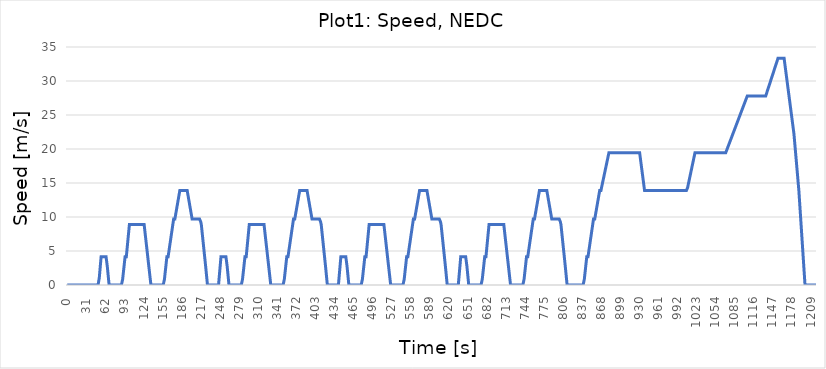
| Category | Series 0 |
|---|---|
| 0.0 | 0 |
| 1.0 | 0 |
| 2.0 | 0 |
| 3.0 | 0 |
| 4.0 | 0 |
| 5.0 | 0 |
| 6.0 | 0 |
| 7.0 | 0 |
| 8.0 | 0 |
| 9.0 | 0 |
| 10.0 | 0 |
| 11.0 | 0 |
| 12.0 | 0 |
| 13.0 | 0 |
| 14.0 | 0 |
| 15.0 | 0 |
| 16.0 | 0 |
| 17.0 | 0 |
| 18.0 | 0 |
| 19.0 | 0 |
| 20.0 | 0 |
| 21.0 | 0 |
| 22.0 | 0 |
| 23.0 | 0 |
| 24.0 | 0 |
| 25.0 | 0 |
| 26.0 | 0 |
| 27.0 | 0 |
| 28.0 | 0 |
| 29.0 | 0 |
| 30.0 | 0 |
| 31.0 | 0 |
| 32.0 | 0 |
| 33.0 | 0 |
| 34.0 | 0 |
| 35.0 | 0 |
| 36.0 | 0 |
| 37.0 | 0 |
| 38.0 | 0 |
| 39.0 | 0 |
| 40.0 | 0 |
| 41.0 | 0 |
| 42.0 | 0 |
| 43.0 | 0 |
| 44.0 | 0 |
| 45.0 | 0 |
| 46.0 | 0 |
| 47.0 | 0 |
| 48.0 | 0 |
| 49.0 | 0 |
| 50.0 | 0 |
| 51.0 | 0 |
| 52.0 | 1.042 |
| 53.0 | 2.083 |
| 54.0 | 3.125 |
| 55.0 | 4.167 |
| 56.0 | 4.167 |
| 57.0 | 4.167 |
| 58.0 | 4.167 |
| 59.0 | 4.167 |
| 60.0 | 4.167 |
| 61.0 | 4.167 |
| 62.0 | 4.167 |
| 63.0 | 4.167 |
| 64.0 | 3.472 |
| 65.0 | 2.778 |
| 66.0 | 1.852 |
| 67.0 | 0.926 |
| 68.0 | 0 |
| 69.0 | 0 |
| 70.0 | 0 |
| 71.0 | 0 |
| 72.0 | 0 |
| 73.0 | 0 |
| 74.0 | 0 |
| 75.0 | 0 |
| 76.0 | 0 |
| 77.0 | 0 |
| 78.0 | 0 |
| 79.0 | 0 |
| 80.0 | 0 |
| 81.0 | 0 |
| 82.0 | 0 |
| 83.0 | 0 |
| 84.0 | 0 |
| 85.0 | 0 |
| 86.0 | 0 |
| 87.0 | 0 |
| 88.0 | 0 |
| 89.0 | 0 |
| 90.0 | 0.833 |
| 91.0 | 1.667 |
| 92.0 | 2.5 |
| 93.0 | 3.333 |
| 94.0 | 4.167 |
| 95.0 | 4.167 |
| 96.0 | 4.167 |
| 97.0 | 5.111 |
| 98.0 | 6.056 |
| 99.0 | 7 |
| 100.0 | 7.944 |
| 101.0 | 8.889 |
| 102.0 | 8.889 |
| 103.0 | 8.889 |
| 104.0 | 8.889 |
| 105.0 | 8.889 |
| 106.0 | 8.889 |
| 107.0 | 8.889 |
| 108.0 | 8.889 |
| 109.0 | 8.889 |
| 110.0 | 8.889 |
| 111.0 | 8.889 |
| 112.0 | 8.889 |
| 113.0 | 8.889 |
| 114.0 | 8.889 |
| 115.0 | 8.889 |
| 116.0 | 8.889 |
| 117.0 | 8.889 |
| 118.0 | 8.889 |
| 119.0 | 8.889 |
| 120.0 | 8.889 |
| 121.0 | 8.889 |
| 122.0 | 8.889 |
| 123.0 | 8.889 |
| 124.0 | 8.889 |
| 125.0 | 8.889 |
| 126.0 | 8.081 |
| 127.0 | 7.273 |
| 128.0 | 6.465 |
| 129.0 | 5.657 |
| 130.0 | 4.848 |
| 131.0 | 4.04 |
| 132.0 | 3.232 |
| 133.0 | 2.424 |
| 134.0 | 1.616 |
| 135.0 | 0.808 |
| 136.0 | 0 |
| 137.0 | 0 |
| 138.0 | 0 |
| 139.0 | 0 |
| 140.0 | 0 |
| 141.0 | 0 |
| 142.0 | 0 |
| 143.0 | 0 |
| 144.0 | 0 |
| 145.0 | 0 |
| 146.0 | 0 |
| 147.0 | 0 |
| 148.0 | 0 |
| 149.0 | 0 |
| 150.0 | 0 |
| 151.0 | 0 |
| 152.0 | 0 |
| 153.0 | 0 |
| 154.0 | 0 |
| 155.0 | 0 |
| 156.0 | 0 |
| 157.0 | 0 |
| 158.0 | 0.833 |
| 159.0 | 1.667 |
| 160.0 | 2.5 |
| 161.0 | 3.333 |
| 162.0 | 4.167 |
| 163.0 | 4.167 |
| 164.0 | 4.167 |
| 165.0 | 4.784 |
| 166.0 | 5.401 |
| 167.0 | 6.019 |
| 168.0 | 6.636 |
| 169.0 | 7.253 |
| 170.0 | 7.87 |
| 171.0 | 8.488 |
| 172.0 | 9.105 |
| 173.0 | 9.722 |
| 174.0 | 9.722 |
| 175.0 | 9.722 |
| 176.0 | 10.243 |
| 177.0 | 10.764 |
| 178.0 | 11.285 |
| 179.0 | 11.806 |
| 180.0 | 12.326 |
| 181.0 | 12.847 |
| 182.0 | 13.368 |
| 183.0 | 13.889 |
| 184.0 | 13.889 |
| 185.0 | 13.889 |
| 186.0 | 13.889 |
| 187.0 | 13.889 |
| 188.0 | 13.889 |
| 189.0 | 13.889 |
| 190.0 | 13.889 |
| 191.0 | 13.889 |
| 192.0 | 13.889 |
| 193.0 | 13.889 |
| 194.0 | 13.889 |
| 195.0 | 13.889 |
| 196.0 | 13.368 |
| 197.0 | 12.847 |
| 198.0 | 12.326 |
| 199.0 | 11.806 |
| 200.0 | 11.285 |
| 201.0 | 10.764 |
| 202.0 | 10.243 |
| 203.0 | 9.722 |
| 204.0 | 9.722 |
| 205.0 | 9.722 |
| 206.0 | 9.722 |
| 207.0 | 9.722 |
| 208.0 | 9.722 |
| 209.0 | 9.722 |
| 210.0 | 9.722 |
| 211.0 | 9.722 |
| 212.0 | 9.722 |
| 213.0 | 9.722 |
| 214.0 | 9.722 |
| 215.0 | 9.722 |
| 216.0 | 9.722 |
| 217.0 | 9.306 |
| 218.0 | 8.889 |
| 219.0 | 8.016 |
| 220.0 | 7.143 |
| 221.0 | 6.27 |
| 222.0 | 5.397 |
| 223.0 | 4.524 |
| 224.0 | 3.651 |
| 225.0 | 2.778 |
| 226.0 | 1.852 |
| 227.0 | 0.926 |
| 228.0 | 0 |
| 229.0 | 0 |
| 230.0 | 0 |
| 231.0 | 0 |
| 232.0 | 0 |
| 233.0 | 0 |
| 234.0 | 0 |
| 235.0 | 0 |
| 236.0 | 0 |
| 237.0 | 0 |
| 238.0 | 0 |
| 239.0 | 0 |
| 240.0 | 0 |
| 241.0 | 0 |
| 242.0 | 0 |
| 243.0 | 0 |
| 244.0 | 0 |
| 245.0 | 0 |
| 246.0 | 0 |
| 247.0 | 1.042 |
| 248.0 | 2.083 |
| 249.0 | 3.125 |
| 250.0 | 4.167 |
| 251.0 | 4.167 |
| 252.0 | 4.167 |
| 253.0 | 4.167 |
| 254.0 | 4.167 |
| 255.0 | 4.167 |
| 256.0 | 4.167 |
| 257.0 | 4.167 |
| 258.0 | 4.167 |
| 259.0 | 3.472 |
| 260.0 | 2.778 |
| 261.0 | 1.852 |
| 262.0 | 0.926 |
| 263.0 | 0 |
| 264.0 | 0 |
| 265.0 | 0 |
| 266.0 | 0 |
| 267.0 | 0 |
| 268.0 | 0 |
| 269.0 | 0 |
| 270.0 | 0 |
| 271.0 | 0 |
| 272.0 | 0 |
| 273.0 | 0 |
| 274.0 | 0 |
| 275.0 | 0 |
| 276.0 | 0 |
| 277.0 | 0 |
| 278.0 | 0 |
| 279.0 | 0 |
| 280.0 | 0 |
| 281.0 | 0 |
| 282.0 | 0 |
| 283.0 | 0 |
| 284.0 | 0 |
| 285.0 | 0.833 |
| 286.0 | 1.667 |
| 287.0 | 2.5 |
| 288.0 | 3.333 |
| 289.0 | 4.167 |
| 290.0 | 4.167 |
| 291.0 | 4.167 |
| 292.0 | 5.111 |
| 293.0 | 6.056 |
| 294.0 | 7 |
| 295.0 | 7.944 |
| 296.0 | 8.889 |
| 297.0 | 8.889 |
| 298.0 | 8.889 |
| 299.0 | 8.889 |
| 300.0 | 8.889 |
| 301.0 | 8.889 |
| 302.0 | 8.889 |
| 303.0 | 8.889 |
| 304.0 | 8.889 |
| 305.0 | 8.889 |
| 306.0 | 8.889 |
| 307.0 | 8.889 |
| 308.0 | 8.889 |
| 309.0 | 8.889 |
| 310.0 | 8.889 |
| 311.0 | 8.889 |
| 312.0 | 8.889 |
| 313.0 | 8.889 |
| 314.0 | 8.889 |
| 315.0 | 8.889 |
| 316.0 | 8.889 |
| 317.0 | 8.889 |
| 318.0 | 8.889 |
| 319.0 | 8.889 |
| 320.0 | 8.889 |
| 321.0 | 8.081 |
| 322.0 | 7.273 |
| 323.0 | 6.465 |
| 324.0 | 5.657 |
| 325.0 | 4.848 |
| 326.0 | 4.04 |
| 327.0 | 3.232 |
| 328.0 | 2.424 |
| 329.0 | 1.616 |
| 330.0 | 0.808 |
| 331.0 | 0 |
| 332.0 | 0 |
| 333.0 | 0 |
| 334.0 | 0 |
| 335.0 | 0 |
| 336.0 | 0 |
| 337.0 | 0 |
| 338.0 | 0 |
| 339.0 | 0 |
| 340.0 | 0 |
| 341.0 | 0 |
| 342.0 | 0 |
| 343.0 | 0 |
| 344.0 | 0 |
| 345.0 | 0 |
| 346.0 | 0 |
| 347.0 | 0 |
| 348.0 | 0 |
| 349.0 | 0 |
| 350.0 | 0 |
| 351.0 | 0 |
| 352.0 | 0 |
| 353.0 | 0.833 |
| 354.0 | 1.667 |
| 355.0 | 2.5 |
| 356.0 | 3.333 |
| 357.0 | 4.167 |
| 358.0 | 4.167 |
| 359.0 | 4.167 |
| 360.0 | 4.784 |
| 361.0 | 5.401 |
| 362.0 | 6.019 |
| 363.0 | 6.636 |
| 364.0 | 7.253 |
| 365.0 | 7.87 |
| 366.0 | 8.488 |
| 367.0 | 9.105 |
| 368.0 | 9.722 |
| 369.0 | 9.722 |
| 370.0 | 9.722 |
| 371.0 | 10.243 |
| 372.0 | 10.764 |
| 373.0 | 11.285 |
| 374.0 | 11.806 |
| 375.0 | 12.326 |
| 376.0 | 12.847 |
| 377.0 | 13.368 |
| 378.0 | 13.889 |
| 379.0 | 13.889 |
| 380.0 | 13.889 |
| 381.0 | 13.889 |
| 382.0 | 13.889 |
| 383.0 | 13.889 |
| 384.0 | 13.889 |
| 385.0 | 13.889 |
| 386.0 | 13.889 |
| 387.0 | 13.889 |
| 388.0 | 13.889 |
| 389.0 | 13.889 |
| 390.0 | 13.889 |
| 391.0 | 13.368 |
| 392.0 | 12.847 |
| 393.0 | 12.326 |
| 394.0 | 11.806 |
| 395.0 | 11.285 |
| 396.0 | 10.764 |
| 397.0 | 10.243 |
| 398.0 | 9.722 |
| 399.0 | 9.722 |
| 400.0 | 9.722 |
| 401.0 | 9.722 |
| 402.0 | 9.722 |
| 403.0 | 9.722 |
| 404.0 | 9.722 |
| 405.0 | 9.722 |
| 406.0 | 9.722 |
| 407.0 | 9.722 |
| 408.0 | 9.722 |
| 409.0 | 9.722 |
| 410.0 | 9.722 |
| 411.0 | 9.722 |
| 412.0 | 9.306 |
| 413.0 | 8.889 |
| 414.0 | 8.016 |
| 415.0 | 7.143 |
| 416.0 | 6.27 |
| 417.0 | 5.397 |
| 418.0 | 4.524 |
| 419.0 | 3.651 |
| 420.0 | 2.778 |
| 421.0 | 1.852 |
| 422.0 | 0.926 |
| 423.0 | 0 |
| 424.0 | 0 |
| 425.0 | 0 |
| 426.0 | 0 |
| 427.0 | 0 |
| 428.0 | 0 |
| 429.0 | 0 |
| 430.0 | 0 |
| 431.0 | 0 |
| 432.0 | 0 |
| 433.0 | 0 |
| 434.0 | 0 |
| 435.0 | 0 |
| 436.0 | 0 |
| 437.0 | 0 |
| 438.0 | 0 |
| 439.0 | 0 |
| 440.0 | 0 |
| 441.0 | 0 |
| 442.0 | 1.042 |
| 443.0 | 2.083 |
| 444.0 | 3.125 |
| 445.0 | 4.167 |
| 446.0 | 4.167 |
| 447.0 | 4.167 |
| 448.0 | 4.167 |
| 449.0 | 4.167 |
| 450.0 | 4.167 |
| 451.0 | 4.167 |
| 452.0 | 4.167 |
| 453.0 | 4.167 |
| 454.0 | 3.472 |
| 455.0 | 2.778 |
| 456.0 | 1.852 |
| 457.0 | 0.926 |
| 458.0 | 0 |
| 459.0 | 0 |
| 460.0 | 0 |
| 461.0 | 0 |
| 462.0 | 0 |
| 463.0 | 0 |
| 464.0 | 0 |
| 465.0 | 0 |
| 466.0 | 0 |
| 467.0 | 0 |
| 468.0 | 0 |
| 469.0 | 0 |
| 470.0 | 0 |
| 471.0 | 0 |
| 472.0 | 0 |
| 473.0 | 0 |
| 474.0 | 0 |
| 475.0 | 0 |
| 476.0 | 0 |
| 477.0 | 0 |
| 478.0 | 0 |
| 479.0 | 0 |
| 480.0 | 0.833 |
| 481.0 | 1.667 |
| 482.0 | 2.5 |
| 483.0 | 3.333 |
| 484.0 | 4.167 |
| 485.0 | 4.167 |
| 486.0 | 4.167 |
| 487.0 | 5.111 |
| 488.0 | 6.056 |
| 489.0 | 7 |
| 490.0 | 7.944 |
| 491.0 | 8.889 |
| 492.0 | 8.889 |
| 493.0 | 8.889 |
| 494.0 | 8.889 |
| 495.0 | 8.889 |
| 496.0 | 8.889 |
| 497.0 | 8.889 |
| 498.0 | 8.889 |
| 499.0 | 8.889 |
| 500.0 | 8.889 |
| 501.0 | 8.889 |
| 502.0 | 8.889 |
| 503.0 | 8.889 |
| 504.0 | 8.889 |
| 505.0 | 8.889 |
| 506.0 | 8.889 |
| 507.0 | 8.889 |
| 508.0 | 8.889 |
| 509.0 | 8.889 |
| 510.0 | 8.889 |
| 511.0 | 8.889 |
| 512.0 | 8.889 |
| 513.0 | 8.889 |
| 514.0 | 8.889 |
| 515.0 | 8.889 |
| 516.0 | 8.081 |
| 517.0 | 7.273 |
| 518.0 | 6.465 |
| 519.0 | 5.657 |
| 520.0 | 4.848 |
| 521.0 | 4.04 |
| 522.0 | 3.232 |
| 523.0 | 2.424 |
| 524.0 | 1.616 |
| 525.0 | 0.808 |
| 526.0 | 0 |
| 527.0 | 0 |
| 528.0 | 0 |
| 529.0 | 0 |
| 530.0 | 0 |
| 531.0 | 0 |
| 532.0 | 0 |
| 533.0 | 0 |
| 534.0 | 0 |
| 535.0 | 0 |
| 536.0 | 0 |
| 537.0 | 0 |
| 538.0 | 0 |
| 539.0 | 0 |
| 540.0 | 0 |
| 541.0 | 0 |
| 542.0 | 0 |
| 543.0 | 0 |
| 544.0 | 0 |
| 545.0 | 0 |
| 546.0 | 0 |
| 547.0 | 0 |
| 548.0 | 0.833 |
| 549.0 | 1.667 |
| 550.0 | 2.5 |
| 551.0 | 3.333 |
| 552.0 | 4.167 |
| 553.0 | 4.167 |
| 554.0 | 4.167 |
| 555.0 | 4.784 |
| 556.0 | 5.401 |
| 557.0 | 6.019 |
| 558.0 | 6.636 |
| 559.0 | 7.253 |
| 560.0 | 7.87 |
| 561.0 | 8.488 |
| 562.0 | 9.105 |
| 563.0 | 9.722 |
| 564.0 | 9.722 |
| 565.0 | 9.722 |
| 566.0 | 10.243 |
| 567.0 | 10.764 |
| 568.0 | 11.285 |
| 569.0 | 11.806 |
| 570.0 | 12.326 |
| 571.0 | 12.847 |
| 572.0 | 13.368 |
| 573.0 | 13.889 |
| 574.0 | 13.889 |
| 575.0 | 13.889 |
| 576.0 | 13.889 |
| 577.0 | 13.889 |
| 578.0 | 13.889 |
| 579.0 | 13.889 |
| 580.0 | 13.889 |
| 581.0 | 13.889 |
| 582.0 | 13.889 |
| 583.0 | 13.889 |
| 584.0 | 13.889 |
| 585.0 | 13.889 |
| 586.0 | 13.368 |
| 587.0 | 12.847 |
| 588.0 | 12.326 |
| 589.0 | 11.806 |
| 590.0 | 11.285 |
| 591.0 | 10.764 |
| 592.0 | 10.243 |
| 593.0 | 9.722 |
| 594.0 | 9.722 |
| 595.0 | 9.722 |
| 596.0 | 9.722 |
| 597.0 | 9.722 |
| 598.0 | 9.722 |
| 599.0 | 9.722 |
| 600.0 | 9.722 |
| 601.0 | 9.722 |
| 602.0 | 9.722 |
| 603.0 | 9.722 |
| 604.0 | 9.722 |
| 605.0 | 9.722 |
| 606.0 | 9.722 |
| 607.0 | 9.306 |
| 608.0 | 8.889 |
| 609.0 | 8.016 |
| 610.0 | 7.143 |
| 611.0 | 6.27 |
| 612.0 | 5.397 |
| 613.0 | 4.524 |
| 614.0 | 3.651 |
| 615.0 | 2.778 |
| 616.0 | 1.852 |
| 617.0 | 0.926 |
| 618.0 | 0 |
| 619.0 | 0 |
| 620.0 | 0 |
| 621.0 | 0 |
| 622.0 | 0 |
| 623.0 | 0 |
| 624.0 | 0 |
| 625.0 | 0 |
| 626.0 | 0 |
| 627.0 | 0 |
| 628.0 | 0 |
| 629.0 | 0 |
| 630.0 | 0 |
| 631.0 | 0 |
| 632.0 | 0 |
| 633.0 | 0 |
| 634.0 | 0 |
| 635.0 | 0 |
| 636.0 | 0 |
| 637.0 | 1.042 |
| 638.0 | 2.083 |
| 639.0 | 3.125 |
| 640.0 | 4.167 |
| 641.0 | 4.167 |
| 642.0 | 4.167 |
| 643.0 | 4.167 |
| 644.0 | 4.167 |
| 645.0 | 4.167 |
| 646.0 | 4.167 |
| 647.0 | 4.167 |
| 648.0 | 4.167 |
| 649.0 | 3.472 |
| 650.0 | 2.778 |
| 651.0 | 1.852 |
| 652.0 | 0.926 |
| 653.0 | 0 |
| 654.0 | 0 |
| 655.0 | 0 |
| 656.0 | 0 |
| 657.0 | 0 |
| 658.0 | 0 |
| 659.0 | 0 |
| 660.0 | 0 |
| 661.0 | 0 |
| 662.0 | 0 |
| 663.0 | 0 |
| 664.0 | 0 |
| 665.0 | 0 |
| 666.0 | 0 |
| 667.0 | 0 |
| 668.0 | 0 |
| 669.0 | 0 |
| 670.0 | 0 |
| 671.0 | 0 |
| 672.0 | 0 |
| 673.0 | 0 |
| 674.0 | 0 |
| 675.0 | 0.833 |
| 676.0 | 1.667 |
| 677.0 | 2.5 |
| 678.0 | 3.333 |
| 679.0 | 4.167 |
| 680.0 | 4.167 |
| 681.0 | 4.167 |
| 682.0 | 5.111 |
| 683.0 | 6.056 |
| 684.0 | 7 |
| 685.0 | 7.944 |
| 686.0 | 8.889 |
| 687.0 | 8.889 |
| 688.0 | 8.889 |
| 689.0 | 8.889 |
| 690.0 | 8.889 |
| 691.0 | 8.889 |
| 692.0 | 8.889 |
| 693.0 | 8.889 |
| 694.0 | 8.889 |
| 695.0 | 8.889 |
| 696.0 | 8.889 |
| 697.0 | 8.889 |
| 698.0 | 8.889 |
| 699.0 | 8.889 |
| 700.0 | 8.889 |
| 701.0 | 8.889 |
| 702.0 | 8.889 |
| 703.0 | 8.889 |
| 704.0 | 8.889 |
| 705.0 | 8.889 |
| 706.0 | 8.889 |
| 707.0 | 8.889 |
| 708.0 | 8.889 |
| 709.0 | 8.889 |
| 710.0 | 8.889 |
| 711.0 | 8.081 |
| 712.0 | 7.273 |
| 713.0 | 6.465 |
| 714.0 | 5.657 |
| 715.0 | 4.848 |
| 716.0 | 4.04 |
| 717.0 | 3.232 |
| 718.0 | 2.424 |
| 719.0 | 1.616 |
| 720.0 | 0.808 |
| 721.0 | 0 |
| 722.0 | 0 |
| 723.0 | 0 |
| 724.0 | 0 |
| 725.0 | 0 |
| 726.0 | 0 |
| 727.0 | 0 |
| 728.0 | 0 |
| 729.0 | 0 |
| 730.0 | 0 |
| 731.0 | 0 |
| 732.0 | 0 |
| 733.0 | 0 |
| 734.0 | 0 |
| 735.0 | 0 |
| 736.0 | 0 |
| 737.0 | 0 |
| 738.0 | 0 |
| 739.0 | 0 |
| 740.0 | 0 |
| 741.0 | 0 |
| 742.0 | 0 |
| 743.0 | 0.833 |
| 744.0 | 1.667 |
| 745.0 | 2.5 |
| 746.0 | 3.333 |
| 747.0 | 4.167 |
| 748.0 | 4.167 |
| 749.0 | 4.167 |
| 750.0 | 4.784 |
| 751.0 | 5.401 |
| 752.0 | 6.019 |
| 753.0 | 6.636 |
| 754.0 | 7.253 |
| 755.0 | 7.87 |
| 756.0 | 8.488 |
| 757.0 | 9.105 |
| 758.0 | 9.722 |
| 759.0 | 9.722 |
| 760.0 | 9.722 |
| 761.0 | 10.243 |
| 762.0 | 10.764 |
| 763.0 | 11.285 |
| 764.0 | 11.806 |
| 765.0 | 12.326 |
| 766.0 | 12.847 |
| 767.0 | 13.368 |
| 768.0 | 13.889 |
| 769.0 | 13.889 |
| 770.0 | 13.889 |
| 771.0 | 13.889 |
| 772.0 | 13.889 |
| 773.0 | 13.889 |
| 774.0 | 13.889 |
| 775.0 | 13.889 |
| 776.0 | 13.889 |
| 777.0 | 13.889 |
| 778.0 | 13.889 |
| 779.0 | 13.889 |
| 780.0 | 13.889 |
| 781.0 | 13.368 |
| 782.0 | 12.847 |
| 783.0 | 12.326 |
| 784.0 | 11.806 |
| 785.0 | 11.285 |
| 786.0 | 10.764 |
| 787.0 | 10.243 |
| 788.0 | 9.722 |
| 789.0 | 9.722 |
| 790.0 | 9.722 |
| 791.0 | 9.722 |
| 792.0 | 9.722 |
| 793.0 | 9.722 |
| 794.0 | 9.722 |
| 795.0 | 9.722 |
| 796.0 | 9.722 |
| 797.0 | 9.722 |
| 798.0 | 9.722 |
| 799.0 | 9.722 |
| 800.0 | 9.722 |
| 801.0 | 9.722 |
| 802.0 | 9.306 |
| 803.0 | 8.889 |
| 804.0 | 8.016 |
| 805.0 | 7.143 |
| 806.0 | 6.27 |
| 807.0 | 5.397 |
| 808.0 | 4.524 |
| 809.0 | 3.651 |
| 810.0 | 2.778 |
| 811.0 | 1.852 |
| 812.0 | 0.926 |
| 813.0 | 0 |
| 814.0 | 0 |
| 815.0 | 0 |
| 816.0 | 0 |
| 817.0 | 0 |
| 818.0 | 0 |
| 819.0 | 0 |
| 820.0 | 0 |
| 821.0 | 0 |
| 822.0 | 0 |
| 823.0 | 0 |
| 824.0 | 0 |
| 825.0 | 0 |
| 826.0 | 0 |
| 827.0 | 0 |
| 828.0 | 0 |
| 829.0 | 0 |
| 830.0 | 0 |
| 831.0 | 0 |
| 832.0 | 0 |
| 833.0 | 0 |
| 834.0 | 0 |
| 835.0 | 0 |
| 836.0 | 0 |
| 837.0 | 0 |
| 838.0 | 0 |
| 839.0 | 0 |
| 840.0 | 0 |
| 841.0 | 0.833 |
| 842.0 | 1.667 |
| 843.0 | 2.5 |
| 844.0 | 3.333 |
| 845.0 | 4.167 |
| 846.0 | 4.167 |
| 847.0 | 4.167 |
| 848.0 | 4.783 |
| 849.0 | 5.4 |
| 850.0 | 6.019 |
| 851.0 | 6.636 |
| 852.0 | 7.253 |
| 853.0 | 7.869 |
| 854.0 | 8.489 |
| 855.0 | 9.106 |
| 856.0 | 9.722 |
| 857.0 | 9.722 |
| 858.0 | 9.722 |
| 859.0 | 10.244 |
| 860.0 | 10.764 |
| 861.0 | 11.286 |
| 862.0 | 11.806 |
| 863.0 | 12.328 |
| 864.0 | 12.847 |
| 865.0 | 13.369 |
| 866.0 | 13.889 |
| 867.0 | 13.889 |
| 868.0 | 13.889 |
| 869.0 | 14.317 |
| 870.0 | 14.744 |
| 871.0 | 15.172 |
| 872.0 | 15.597 |
| 873.0 | 16.025 |
| 874.0 | 16.453 |
| 875.0 | 16.881 |
| 876.0 | 17.308 |
| 877.0 | 17.736 |
| 878.0 | 18.161 |
| 879.0 | 18.589 |
| 880.0 | 19.017 |
| 881.0 | 19.444 |
| 882.0 | 19.444 |
| 883.0 | 19.444 |
| 884.0 | 19.444 |
| 885.0 | 19.444 |
| 886.0 | 19.444 |
| 887.0 | 19.444 |
| 888.0 | 19.444 |
| 889.0 | 19.444 |
| 890.0 | 19.444 |
| 891.0 | 19.444 |
| 892.0 | 19.444 |
| 893.0 | 19.444 |
| 894.0 | 19.444 |
| 895.0 | 19.444 |
| 896.0 | 19.444 |
| 897.0 | 19.444 |
| 898.0 | 19.444 |
| 899.0 | 19.444 |
| 900.0 | 19.444 |
| 901.0 | 19.444 |
| 902.0 | 19.444 |
| 903.0 | 19.444 |
| 904.0 | 19.444 |
| 905.0 | 19.444 |
| 906.0 | 19.444 |
| 907.0 | 19.444 |
| 908.0 | 19.444 |
| 909.0 | 19.444 |
| 910.0 | 19.444 |
| 911.0 | 19.444 |
| 912.0 | 19.444 |
| 913.0 | 19.444 |
| 914.0 | 19.444 |
| 915.0 | 19.444 |
| 916.0 | 19.444 |
| 917.0 | 19.444 |
| 918.0 | 19.444 |
| 919.0 | 19.444 |
| 920.0 | 19.444 |
| 921.0 | 19.444 |
| 922.0 | 19.444 |
| 923.0 | 19.444 |
| 924.0 | 19.444 |
| 925.0 | 19.444 |
| 926.0 | 19.444 |
| 927.0 | 19.444 |
| 928.0 | 19.444 |
| 929.0 | 19.444 |
| 930.0 | 19.444 |
| 931.0 | 19.444 |
| 932.0 | 18.75 |
| 933.0 | 18.056 |
| 934.0 | 17.361 |
| 935.0 | 16.667 |
| 936.0 | 15.972 |
| 937.0 | 15.278 |
| 938.0 | 14.583 |
| 939.0 | 13.889 |
| 940.0 | 13.889 |
| 941.0 | 13.889 |
| 942.0 | 13.889 |
| 943.0 | 13.889 |
| 944.0 | 13.889 |
| 945.0 | 13.889 |
| 946.0 | 13.889 |
| 947.0 | 13.889 |
| 948.0 | 13.889 |
| 949.0 | 13.889 |
| 950.0 | 13.889 |
| 951.0 | 13.889 |
| 952.0 | 13.889 |
| 953.0 | 13.889 |
| 954.0 | 13.889 |
| 955.0 | 13.889 |
| 956.0 | 13.889 |
| 957.0 | 13.889 |
| 958.0 | 13.889 |
| 959.0 | 13.889 |
| 960.0 | 13.889 |
| 961.0 | 13.889 |
| 962.0 | 13.889 |
| 963.0 | 13.889 |
| 964.0 | 13.889 |
| 965.0 | 13.889 |
| 966.0 | 13.889 |
| 967.0 | 13.889 |
| 968.0 | 13.889 |
| 969.0 | 13.889 |
| 970.0 | 13.889 |
| 971.0 | 13.889 |
| 972.0 | 13.889 |
| 973.0 | 13.889 |
| 974.0 | 13.889 |
| 975.0 | 13.889 |
| 976.0 | 13.889 |
| 977.0 | 13.889 |
| 978.0 | 13.889 |
| 979.0 | 13.889 |
| 980.0 | 13.889 |
| 981.0 | 13.889 |
| 982.0 | 13.889 |
| 983.0 | 13.889 |
| 984.0 | 13.889 |
| 985.0 | 13.889 |
| 986.0 | 13.889 |
| 987.0 | 13.889 |
| 988.0 | 13.889 |
| 989.0 | 13.889 |
| 990.0 | 13.889 |
| 991.0 | 13.889 |
| 992.0 | 13.889 |
| 993.0 | 13.889 |
| 994.0 | 13.889 |
| 995.0 | 13.889 |
| 996.0 | 13.889 |
| 997.0 | 13.889 |
| 998.0 | 13.889 |
| 999.0 | 13.889 |
| 1000.0 | 13.889 |
| 1001.0 | 13.889 |
| 1002.0 | 13.889 |
| 1003.0 | 13.889 |
| 1004.0 | 13.889 |
| 1005.0 | 13.889 |
| 1006.0 | 13.889 |
| 1007.0 | 13.889 |
| 1008.0 | 13.889 |
| 1009.0 | 14.317 |
| 1010.0 | 14.744 |
| 1011.0 | 15.172 |
| 1012.0 | 15.597 |
| 1013.0 | 16.025 |
| 1014.0 | 16.453 |
| 1015.0 | 16.881 |
| 1016.0 | 17.308 |
| 1017.0 | 17.736 |
| 1018.0 | 18.161 |
| 1019.0 | 18.589 |
| 1020.0 | 19.017 |
| 1021.0 | 19.444 |
| 1022.0 | 19.444 |
| 1023.0 | 19.444 |
| 1024.0 | 19.444 |
| 1025.0 | 19.444 |
| 1026.0 | 19.444 |
| 1027.0 | 19.444 |
| 1028.0 | 19.444 |
| 1029.0 | 19.444 |
| 1030.0 | 19.444 |
| 1031.0 | 19.444 |
| 1032.0 | 19.444 |
| 1033.0 | 19.444 |
| 1034.0 | 19.444 |
| 1035.0 | 19.444 |
| 1036.0 | 19.444 |
| 1037.0 | 19.444 |
| 1038.0 | 19.444 |
| 1039.0 | 19.444 |
| 1040.0 | 19.444 |
| 1041.0 | 19.444 |
| 1042.0 | 19.444 |
| 1043.0 | 19.444 |
| 1044.0 | 19.444 |
| 1045.0 | 19.444 |
| 1046.0 | 19.444 |
| 1047.0 | 19.444 |
| 1048.0 | 19.444 |
| 1049.0 | 19.444 |
| 1050.0 | 19.444 |
| 1051.0 | 19.444 |
| 1052.0 | 19.444 |
| 1053.0 | 19.444 |
| 1054.0 | 19.444 |
| 1055.0 | 19.444 |
| 1056.0 | 19.444 |
| 1057.0 | 19.444 |
| 1058.0 | 19.444 |
| 1059.0 | 19.444 |
| 1060.0 | 19.444 |
| 1061.0 | 19.444 |
| 1062.0 | 19.444 |
| 1063.0 | 19.444 |
| 1064.0 | 19.444 |
| 1065.0 | 19.444 |
| 1066.0 | 19.444 |
| 1067.0 | 19.444 |
| 1068.0 | 19.444 |
| 1069.0 | 19.444 |
| 1070.0 | 19.444 |
| 1071.0 | 19.444 |
| 1072.0 | 19.683 |
| 1073.0 | 19.919 |
| 1074.0 | 20.158 |
| 1075.0 | 20.397 |
| 1076.0 | 20.636 |
| 1077.0 | 20.872 |
| 1078.0 | 21.111 |
| 1079.0 | 21.35 |
| 1080.0 | 21.586 |
| 1081.0 | 21.825 |
| 1082.0 | 22.064 |
| 1083.0 | 22.303 |
| 1084.0 | 22.539 |
| 1085.0 | 22.778 |
| 1086.0 | 23.017 |
| 1087.0 | 23.253 |
| 1088.0 | 23.492 |
| 1089.0 | 23.731 |
| 1090.0 | 23.969 |
| 1091.0 | 24.206 |
| 1092.0 | 24.444 |
| 1093.0 | 24.683 |
| 1094.0 | 24.919 |
| 1095.0 | 25.158 |
| 1096.0 | 25.397 |
| 1097.0 | 25.636 |
| 1098.0 | 25.872 |
| 1099.0 | 26.111 |
| 1100.0 | 26.35 |
| 1101.0 | 26.586 |
| 1102.0 | 26.825 |
| 1103.0 | 27.064 |
| 1104.0 | 27.303 |
| 1105.0 | 27.539 |
| 1106.0 | 27.778 |
| 1107.0 | 27.778 |
| 1108.0 | 27.778 |
| 1109.0 | 27.778 |
| 1110.0 | 27.778 |
| 1111.0 | 27.778 |
| 1112.0 | 27.778 |
| 1113.0 | 27.778 |
| 1114.0 | 27.778 |
| 1115.0 | 27.778 |
| 1116.0 | 27.778 |
| 1117.0 | 27.778 |
| 1118.0 | 27.778 |
| 1119.0 | 27.778 |
| 1120.0 | 27.778 |
| 1121.0 | 27.778 |
| 1122.0 | 27.778 |
| 1123.0 | 27.778 |
| 1124.0 | 27.778 |
| 1125.0 | 27.778 |
| 1126.0 | 27.778 |
| 1127.0 | 27.778 |
| 1128.0 | 27.778 |
| 1129.0 | 27.778 |
| 1130.0 | 27.778 |
| 1131.0 | 27.778 |
| 1132.0 | 27.778 |
| 1133.0 | 27.778 |
| 1134.0 | 27.778 |
| 1135.0 | 27.778 |
| 1136.0 | 27.778 |
| 1137.0 | 28.056 |
| 1138.0 | 28.333 |
| 1139.0 | 28.611 |
| 1140.0 | 28.889 |
| 1141.0 | 29.167 |
| 1142.0 | 29.444 |
| 1143.0 | 29.722 |
| 1144.0 | 30 |
| 1145.0 | 30.278 |
| 1146.0 | 30.556 |
| 1147.0 | 30.833 |
| 1148.0 | 31.111 |
| 1149.0 | 31.389 |
| 1150.0 | 31.667 |
| 1151.0 | 31.944 |
| 1152.0 | 32.222 |
| 1153.0 | 32.5 |
| 1154.0 | 32.778 |
| 1155.0 | 33.056 |
| 1156.0 | 33.333 |
| 1157.0 | 33.333 |
| 1158.0 | 33.333 |
| 1159.0 | 33.333 |
| 1160.0 | 33.333 |
| 1161.0 | 33.333 |
| 1162.0 | 33.333 |
| 1163.0 | 33.333 |
| 1164.0 | 33.333 |
| 1165.0 | 33.333 |
| 1166.0 | 33.333 |
| 1167.0 | 32.639 |
| 1168.0 | 31.944 |
| 1169.0 | 31.25 |
| 1170.0 | 30.556 |
| 1171.0 | 29.861 |
| 1172.0 | 29.167 |
| 1173.0 | 28.472 |
| 1174.0 | 27.778 |
| 1175.0 | 27.083 |
| 1176.0 | 26.389 |
| 1177.0 | 25.694 |
| 1178.0 | 25 |
| 1179.0 | 24.306 |
| 1180.0 | 23.611 |
| 1181.0 | 22.917 |
| 1182.0 | 22.222 |
| 1183.0 | 21.181 |
| 1184.0 | 20.139 |
| 1185.0 | 19.097 |
| 1186.0 | 18.056 |
| 1187.0 | 17.014 |
| 1188.0 | 15.972 |
| 1189.0 | 14.931 |
| 1190.0 | 13.889 |
| 1191.0 | 12.5 |
| 1192.0 | 11.111 |
| 1193.0 | 9.722 |
| 1194.0 | 8.333 |
| 1195.0 | 6.944 |
| 1196.0 | 5.556 |
| 1197.0 | 4.167 |
| 1198.0 | 2.778 |
| 1199.0 | 1.389 |
| 1200.0 | 0 |
| 1201.0 | 0 |
| 1202.0 | 0 |
| 1203.0 | 0 |
| 1204.0 | 0 |
| 1205.0 | 0 |
| 1206.0 | 0 |
| 1207.0 | 0 |
| 1208.0 | 0 |
| 1209.0 | 0 |
| 1210.0 | 0 |
| 1211.0 | 0 |
| 1212.0 | 0 |
| 1213.0 | 0 |
| 1214.0 | 0 |
| 1215.0 | 0 |
| 1216.0 | 0 |
| 1217.0 | 0 |
| 1218.0 | 0 |
| 1219.0 | 0 |